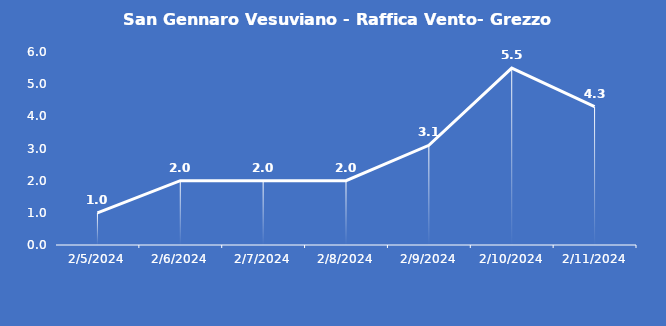
| Category | San Gennaro Vesuviano - Raffica Vento- Grezzo (m/s) |
|---|---|
| 2/5/24 | 1 |
| 2/6/24 | 2 |
| 2/7/24 | 2 |
| 2/8/24 | 2 |
| 2/9/24 | 3.1 |
| 2/10/24 | 5.5 |
| 2/11/24 | 4.3 |